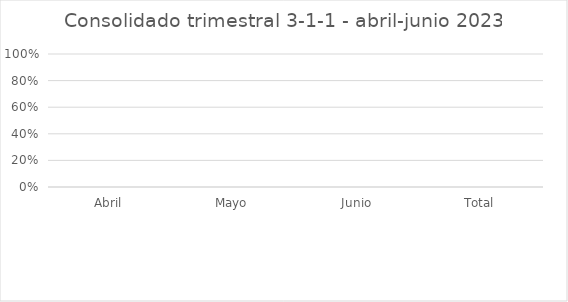
| Category | Hospital Dr. Marcelino Vélez Santana |
|---|---|
| Abril | 0 |
| Mayo | 0 |
| Junio | 0 |
| Total | 0 |